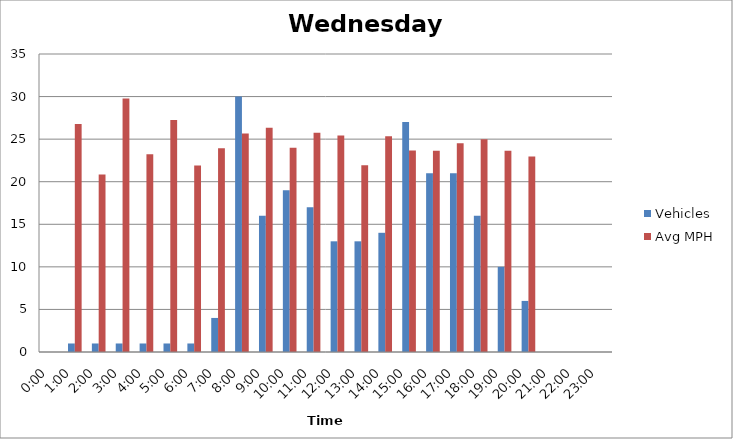
| Category | Vehicles | Avg MPH |
|---|---|---|
| 0:00 | 0 | 0 |
| 1:00 | 1 | 26.78 |
| 2:00 | 1 | 20.85 |
| 3:00 | 1 | 29.77 |
| 4:00 | 1 | 23.24 |
| 5:00 | 1 | 27.24 |
| 6:00 | 1 | 21.9 |
| 7:00 | 4 | 23.94 |
| 8:00 | 30 | 25.66 |
| 9:00 | 16 | 26.35 |
| 10:00 | 19 | 24 |
| 11:00 | 17 | 25.74 |
| 12:00 | 13 | 25.43 |
| 13:00 | 13 | 21.93 |
| 14:00 | 14 | 25.33 |
| 15:00 | 27 | 23.66 |
| 16:00 | 21 | 23.63 |
| 17:00 | 21 | 24.51 |
| 18:00 | 16 | 24.98 |
| 19:00 | 10 | 23.63 |
| 20:00 | 6 | 22.97 |
| 21:00 | 0 | 0 |
| 22:00 | 0 | 0 |
| 23:00 | 0 | 0 |